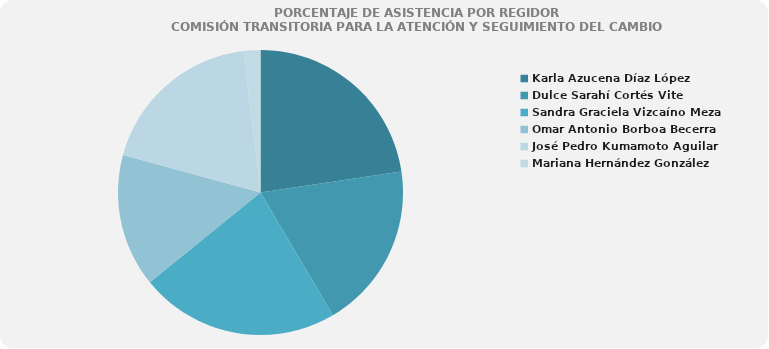
| Category | Series 0 |
|---|---|
| Karla Azucena Díaz López | 100 |
| Dulce Sarahí Cortés Vite | 83.333 |
| Sandra Graciela Vizcaíno Meza | 100 |
| Omar Antonio Borboa Becerra | 66.667 |
| José Pedro Kumamoto Aguilar | 83.333 |
| Mariana Hernández González | 8.333 |